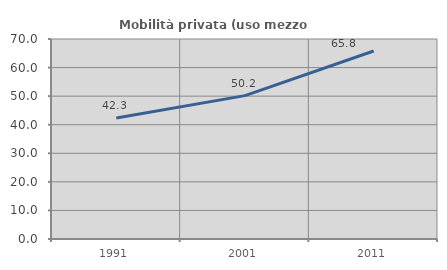
| Category | Mobilità privata (uso mezzo privato) |
|---|---|
| 1991.0 | 42.333 |
| 2001.0 | 50.174 |
| 2011.0 | 65.809 |